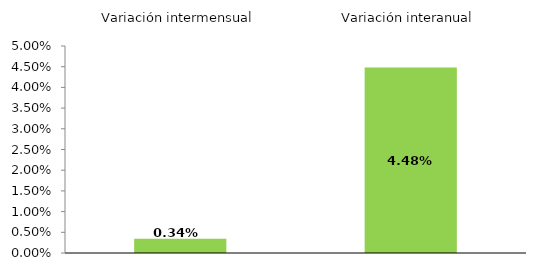
| Category | Series 0 |
|---|---|
| 0 | 0.342 |
| 1 | 4.478 |